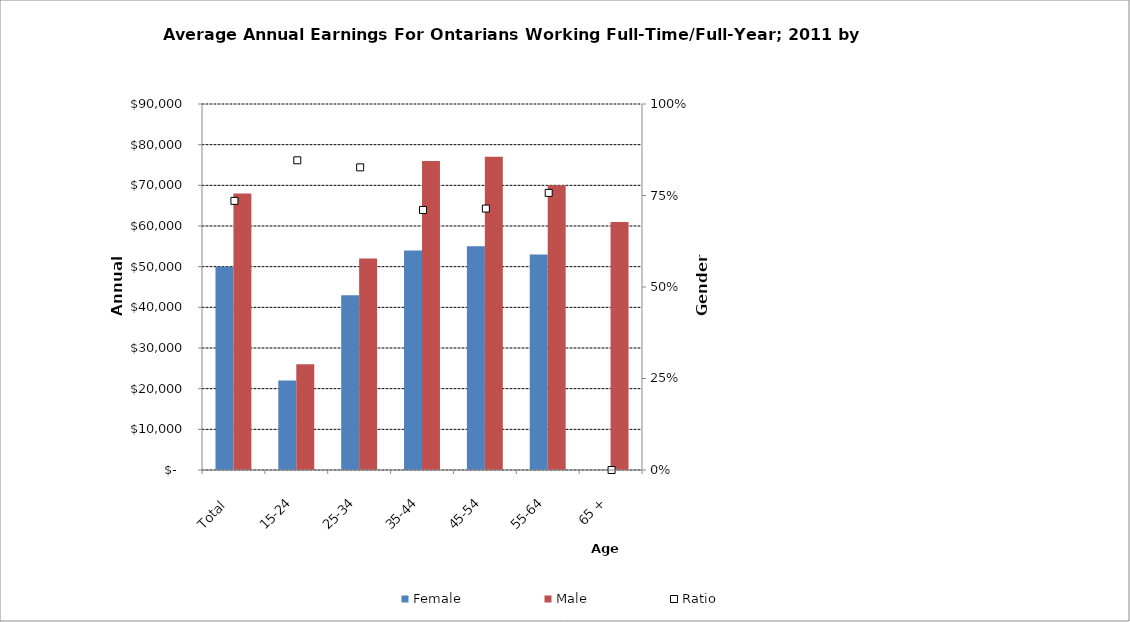
| Category | Female | Male |
|---|---|---|
| Total | 50000 | 68000 |
|  15-24  | 22000 | 26000 |
|  25-34  | 43000 | 52000 |
|  35-44  | 54000 | 76000 |
|  45-54  | 55000 | 77000 |
|  55-64  | 53000 | 70000 |
|  65 +  | 0 | 61000 |